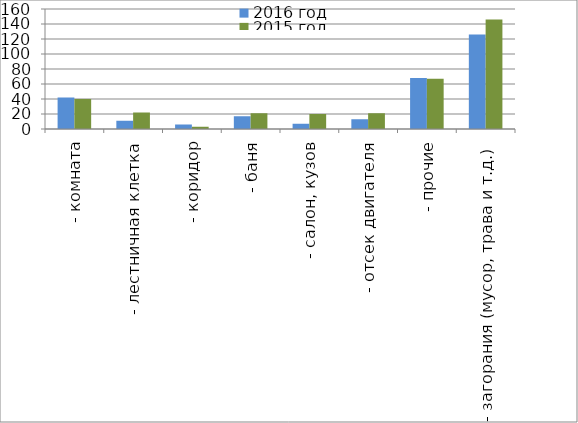
| Category | 2016 год | 2015 год |
|---|---|---|
|  - комната | 42 | 40 |
|  - лестничная клетка | 11 | 22 |
|  - коридор | 6 | 3 |
|  - баня | 17 | 21 |
|  - салон, кузов | 7 | 20 |
|  - отсек двигателя | 13 | 21 |
| - прочие | 68 | 67 |
| - загорания (мусор, трава и т.д.)  | 126 | 146 |